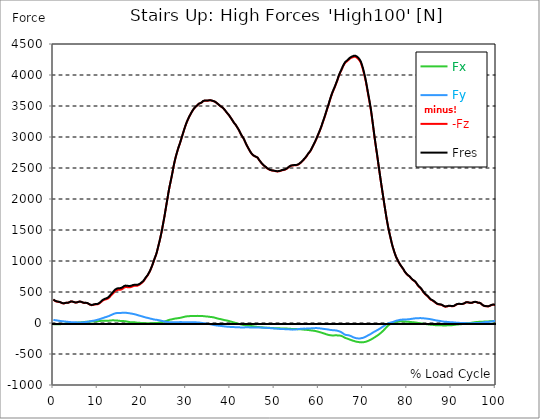
| Category |  Fx |  Fy |  -Fz |  Fres |
|---|---|---|---|---|
| 0.0 | -20.727 | 50.693 | 376.171 | 380.467 |
| 0.16678370786516855 | -21.302 | 48.392 | 366.518 | 370.706 |
| 0.3335674157303371 | -21.823 | 46.163 | 357.134 | 361.215 |
| 0.5003511235955057 | -21.769 | 44.599 | 350.213 | 354.222 |
| 0.6671348314606742 | -21.41 | 43.233 | 346.348 | 350.231 |
| 0.8339185393258427 | -20.745 | 41.561 | 344.012 | 347.643 |
| 1.0007022471910114 | -19.684 | 39.494 | 342.412 | 345.737 |
| 1.1674859550561796 | -18.821 | 37.157 | 340.956 | 343.994 |
| 1.3342696629213484 | -18.516 | 35.036 | 338.421 | 341.243 |
| 1.5010533707865168 | -18.39 | 32.986 | 334.844 | 337.54 |
| 1.6678370786516854 | -18.282 | 31.279 | 330.296 | 332.866 |
| 1.8346207865168538 | -17.743 | 29.877 | 325.298 | 327.743 |
| 2.001404494382023 | -16.592 | 28.69 | 319.492 | 321.865 |
| 2.1681882022471908 | -15.388 | 27.486 | 314.818 | 317.065 |
| 2.334971910112359 | -13.95 | 26.353 | 314.62 | 316.688 |
| 2.501755617977528 | -11.864 | 25.364 | 317.425 | 319.312 |
| 2.668539325842697 | -9.743 | 23.89 | 321.721 | 323.357 |
| 2.8353230337078656 | -8.557 | 22.111 | 325.658 | 327.114 |
| 3.0021067415730336 | -8.305 | 20.727 | 326.88 | 328.264 |
| 3.168890449438202 | -7.82 | 19.45 | 326.593 | 327.941 |
| 3.335674157303371 | -6.975 | 18.318 | 326.269 | 327.527 |
| 3.502457865168539 | -5.393 | 17.149 | 330.709 | 331.878 |
| 3.6692415730337076 | -4.17 | 15.927 | 335.814 | 336.875 |
| 3.8360252808988764 | -2.66 | 14.597 | 342.484 | 343.49 |
| 4.002808988764046 | -1.312 | 13.464 | 347.517 | 348.488 |
| 4.169592696629214 | -0.449 | 12.691 | 347.751 | 348.685 |
| 4.3363764044943816 | 0.036 | 12.062 | 344.479 | 345.396 |
| 4.50316011235955 | 0.288 | 11.613 | 340.758 | 341.657 |
| 4.669943820224718 | 0.395 | 11.217 | 335.85 | 336.749 |
| 4.836727528089888 | 0.737 | 10.858 | 331.608 | 332.525 |
| 5.003511235955056 | 1.959 | 10.516 | 330.26 | 331.194 |
| 5.170294943820225 | 3.649 | 10.211 | 330.547 | 331.482 |
| 5.337078651685394 | 5.087 | 9.905 | 332.435 | 333.388 |
| 5.5038623595505625 | 6.418 | 9.456 | 335.742 | 336.695 |
| 5.670646067415731 | 7.55 | 8.988 | 339.913 | 340.866 |
| 5.837429775280899 | 8.629 | 8.485 | 344.281 | 345.216 |
| 6.004213483146067 | 9.258 | 8.395 | 345.45 | 346.384 |
| 6.170997191011236 | 9.887 | 8.844 | 343.095 | 344.048 |
| 6.329002808988764 | 10.426 | 9.312 | 339.607 | 340.578 |
| 6.495786516853932 | 11.595 | 10.031 | 335.113 | 336.102 |
| 6.662570224719101 | 13.069 | 11.199 | 329.631 | 330.673 |
| 6.82935393258427 | 14.363 | 12.17 | 325.334 | 326.467 |
| 6.9961376404494375 | 15.873 | 13.105 | 323.123 | 324.328 |
| 7.162921348314607 | 17.635 | 14.165 | 323.842 | 325.154 |
| 7.329705056179775 | 19.217 | 15.172 | 325.154 | 326.557 |
| 7.496488764044945 | 20.349 | 16.466 | 324.166 | 325.694 |
| 7.663272471910113 | 21.068 | 18.534 | 320.642 | 322.314 |
| 7.830056179775281 | 21.5 | 20.457 | 315.285 | 317.137 |
| 7.996839887640449 | 21.877 | 22.866 | 307.16 | 309.21 |
| 8.16362359550562 | 22.309 | 25.472 | 298.55 | 300.833 |
| 8.330407303370787 | 22.92 | 27.863 | 293.948 | 296.518 |
| 8.497191011235955 | 23.747 | 30.038 | 289.705 | 292.581 |
| 8.663974719101123 | 24.771 | 32.07 | 287.35 | 290.55 |
| 8.830758426966291 | 26.012 | 34.209 | 289.13 | 292.617 |
| 8.99754213483146 | 26.928 | 36.348 | 292.24 | 295.997 |
| 9.16432584269663 | 27.665 | 38.541 | 296.464 | 300.491 |
| 9.331109550561798 | 27.737 | 40.626 | 299.862 | 304.104 |
| 9.497893258426966 | 27.252 | 42.676 | 300.096 | 304.572 |
| 9.664676966292134 | 27.324 | 45.786 | 300.203 | 305.165 |
| 9.831460674157304 | 27.414 | 48.877 | 300.311 | 305.758 |
| 9.998244382022472 | 28.025 | 52.491 | 301.606 | 307.7 |
| 10.16502808988764 | 29.625 | 56.086 | 306.225 | 313.003 |
| 10.331811797752808 | 31.153 | 59.663 | 313.326 | 320.75 |
| 10.498595505617978 | 32.663 | 63.258 | 321.056 | 329.073 |
| 10.665379213483147 | 33.903 | 67.267 | 330.673 | 339.356 |
| 10.832162921348315 | 34.874 | 71.51 | 341.998 | 351.346 |
| 10.998946629213483 | 35.791 | 75.68 | 353.108 | 363.12 |
| 11.165730337078653 | 36.312 | 79.527 | 361.682 | 372.306 |
| 11.33251404494382 | 36.222 | 83.41 | 368.783 | 380.072 |
| 11.49929775280899 | 36.096 | 87.221 | 374.068 | 386.058 |
| 11.666081460674157 | 36.15 | 91.877 | 378.292 | 391.199 |
| 11.832865168539326 | 35.557 | 95.418 | 381.24 | 394.848 |
| 11.999648876404493 | 34.964 | 98.456 | 384.099 | 398.336 |
| 12.166432584269662 | 34.748 | 102.069 | 387.802 | 402.812 |
| 12.333216292134832 | 35.719 | 106.815 | 394.417 | 410.434 |
| 12.5 | 36.923 | 111.345 | 402.596 | 419.566 |
| 12.66678370786517 | 38.379 | 115.785 | 413.346 | 431.16 |
| 12.833567415730336 | 40.051 | 120.513 | 426.199 | 444.894 |
| 13.000351123595506 | 41.309 | 126.912 | 441.245 | 461.145 |
| 13.167134831460674 | 42.496 | 132.916 | 454.296 | 475.382 |
| 13.333918539325843 | 42.927 | 137.68 | 465.549 | 487.498 |
| 13.500702247191011 | 42.766 | 142.839 | 477.162 | 500.027 |
| 13.667485955056181 | 42.64 | 147.801 | 491.327 | 514.948 |
| 13.834269662921349 | 42.352 | 152.546 | 505.061 | 529.401 |
| 14.001053370786519 | 41.166 | 155.926 | 515.559 | 540.294 |
| 14.167837078651687 | 40.447 | 158.461 | 522.66 | 547.736 |
| 14.334620786516853 | 39.62 | 160.6 | 528.646 | 553.992 |
| 14.501404494382026 | 38.847 | 161.876 | 532.87 | 558.36 |
| 14.668188202247192 | 37.876 | 162.577 | 535.549 | 561.093 |
| 14.834971910112362 | 36.15 | 162.541 | 535.872 | 561.344 |
| 15.001755617977528 | 34.514 | 162.523 | 535.944 | 561.362 |
| 15.168539325842698 | 32.861 | 162.505 | 536.016 | 561.38 |
| 15.335323033707864 | 32.124 | 162.955 | 539.755 | 565.048 |
| 15.502106741573034 | 31.764 | 163.997 | 545.4 | 570.71 |
| 15.6688904494382 | 31.405 | 164.734 | 553.093 | 578.242 |
| 15.83567415730337 | 31.099 | 165.633 | 562.783 | 587.752 |
| 16.00245786516854 | 30.416 | 166.101 | 571.483 | 596.164 |
| 16.16924157303371 | 29.373 | 165.885 | 577.361 | 601.665 |
| 16.336025280898877 | 27.809 | 165.076 | 579.357 | 603.301 |
| 16.502808988764045 | 25.418 | 163.889 | 579.896 | 603.409 |
| 16.669592696629216 | 23.064 | 162.344 | 578.566 | 601.647 |
| 16.83637640449438 | 20.403 | 160.6 | 576.337 | 599.023 |
| 17.003160112359552 | 18.048 | 159.198 | 574.863 | 597.243 |
| 17.169943820224717 | 15.675 | 157.508 | 574.305 | 596.308 |
| 17.336727528089888 | 13.752 | 155.531 | 575.492 | 596.955 |
| 17.503511235955056 | 13.069 | 153.553 | 578.961 | 599.832 |
| 17.670294943820224 | 12.296 | 151.594 | 582.772 | 603.085 |
| 17.837078651685395 | 12.583 | 149.401 | 588.147 | 607.777 |
| 18.003862359550563 | 12.943 | 147.154 | 593.126 | 612.091 |
| 18.17064606741573 | 12.835 | 144.745 | 597.207 | 615.507 |
| 18.3374297752809 | 11.864 | 142.012 | 599.85 | 617.448 |
| 18.504213483146067 | 10.031 | 139.028 | 600.155 | 617.107 |
| 18.662219101123597 | 7.802 | 135.721 | 599.85 | 616.046 |
| 18.829002808988765 | 5.555 | 132.197 | 599.382 | 614.77 |
| 18.995786516853933 | 4.278 | 128.746 | 601.539 | 616.172 |
| 19.1625702247191 | 3.541 | 124.45 | 606.285 | 619.929 |
| 19.32935393258427 | 3.074 | 120.8 | 612.469 | 625.232 |
| 19.49613764044944 | 2.607 | 117.691 | 620.109 | 632.207 |
| 19.662921348314608 | 1.87 | 114.724 | 627.497 | 639.074 |
| 19.829705056179776 | 1.24 | 111.201 | 638.013 | 648.835 |
| 19.996488764044944 | 0.647 | 107.875 | 647.846 | 658.093 |
| 20.163272471910112 | -0.162 | 104.568 | 657.14 | 666.919 |
| 20.33005617977528 | -1.204 | 101.045 | 668.735 | 677.902 |
| 20.49683988764045 | -1.995 | 97.305 | 684.931 | 693.344 |
| 20.663623595505616 | -2.553 | 93.602 | 702.332 | 709.99 |
| 20.830407303370787 | -2.229 | 89.863 | 721.297 | 728.326 |
| 20.997191011235955 | -2.409 | 87.239 | 738.357 | 745.152 |
| 21.163974719101123 | -2.984 | 85.1 | 751.929 | 758.58 |
| 21.330758426966295 | -3.218 | 82.295 | 768.97 | 775.262 |
| 21.497542134831463 | -2.894 | 78.79 | 791.44 | 797.193 |
| 21.66432584269663 | -2.876 | 76.183 | 813.066 | 818.513 |
| 21.8311095505618 | -2.948 | 73.721 | 834.062 | 839.203 |
| 21.997893258426966 | -2.337 | 69.766 | 863.381 | 867.965 |
| 22.164676966292134 | -2.696 | 67.213 | 892.593 | 896.997 |
| 22.331460674157306 | -2.966 | 64.876 | 920.816 | 925.04 |
| 22.498244382022467 | -2.193 | 61.209 | 955.725 | 959.447 |
| 22.66502808988764 | -1.654 | 57.919 | 991.139 | 994.428 |
| 22.831811797752806 | -1.186 | 55.726 | 1025.653 | 1028.727 |
| 22.99859550561798 | -0.719 | 54.252 | 1058.064 | 1060.976 |
| 23.165379213483146 | -0.27 | 53.192 | 1089.325 | 1092.075 |
| 23.332162921348313 | 0.18 | 52.652 | 1125.08 | 1127.668 |
| 23.49894662921348 | 0.989 | 50.298 | 1170.865 | 1173.202 |
| 23.665730337078653 | 2.714 | 47.206 | 1219.527 | 1221.576 |
| 23.83251404494382 | 5.033 | 44.473 | 1268.279 | 1270.094 |
| 23.999297752808985 | 8.323 | 42.748 | 1316.904 | 1318.594 |
| 24.166081460674157 | 10.696 | 40.878 | 1367.22 | 1368.802 |
| 24.332865168539325 | 12.332 | 38.092 | 1422.677 | 1424.115 |
| 24.499648876404496 | 13.734 | 35.323 | 1480.416 | 1481.729 |
| 24.666432584269664 | 15.945 | 31.98 | 1543.261 | 1544.448 |
| 24.833216292134832 | 18.372 | 28.42 | 1608.012 | 1609.09 |
| 25.0 | 21.05 | 25.958 | 1670.695 | 1671.702 |
| 25.16678370786517 | 24.07 | 23.765 | 1737.531 | 1738.537 |
| 25.33356741573034 | 28.079 | 21.518 | 1811.521 | 1812.546 |
| 25.500351123595504 | 32.555 | 19.72 | 1882.186 | 1883.264 |
| 25.66713483146067 | 37.085 | 18.569 | 1953.713 | 1954.882 |
| 25.833918539325843 | 40.986 | 17.365 | 2020.549 | 2021.825 |
| 26.00070224719101 | 46.037 | 15.046 | 2094.305 | 2095.69 |
| 26.16748595505618 | 50.046 | 12.907 | 2160.566 | 2162.058 |
| 26.334269662921347 | 53.174 | 11.667 | 2220.732 | 2222.314 |
| 26.50105337078652 | 54.846 | 10.894 | 2276.153 | 2277.753 |
| 26.667837078651687 | 57.236 | 10.498 | 2332.473 | 2334.145 |
| 26.834620786516858 | 60.58 | 10.228 | 2392.675 | 2394.437 |
| 27.001404494382022 | 63.564 | 10.552 | 2454.711 | 2456.563 |
| 27.16818820224719 | 66.26 | 11.487 | 2518.833 | 2520.738 |
| 27.334971910112362 | 68.867 | 12.134 | 2577.13 | 2579.089 |
| 27.50175561797753 | 70.88 | 12.116 | 2627.912 | 2629.908 |
| 27.668539325842698 | 72.678 | 11.9 | 2676.754 | 2678.785 |
| 27.835323033707866 | 74.134 | 11.613 | 2719.609 | 2721.641 |
| 28.002106741573037 | 75.806 | 11.613 | 2760.469 | 2762.519 |
| 28.168890449438205 | 77.568 | 11.954 | 2802.318 | 2804.385 |
| 28.335674157303373 | 79.419 | 12.871 | 2839.673 | 2841.722 |
| 28.502457865168537 | 81.253 | 13.986 | 2872.929 | 2874.942 |
| 28.669241573033705 | 83.338 | 15.1 | 2908.342 | 2910.337 |
| 28.836025280898877 | 85.477 | 15.531 | 2946.955 | 2948.95 |
| 29.002808988764052 | 88.443 | 14.381 | 2986.521 | 2988.516 |
| 29.169592696629213 | 91.661 | 13.033 | 3025.439 | 3027.417 |
| 29.336376404494384 | 94.987 | 11.882 | 3063.261 | 3065.239 |
| 29.50316011235955 | 98.258 | 10.948 | 3101.065 | 3103.061 |
| 29.669943820224724 | 100.757 | 12.206 | 3139.84 | 3141.871 |
| 29.836727528089884 | 103.885 | 12.44 | 3174.84 | 3176.907 |
| 30.003511235955056 | 105.718 | 12.907 | 3208.24 | 3210.325 |
| 30.170294943820224 | 107.138 | 12.889 | 3239.303 | 3241.406 |
| 30.337078651685395 | 108.666 | 12.17 | 3267.04 | 3269.161 |
| 30.503862359550563 | 109.727 | 12.008 | 3293.357 | 3295.497 |
| 30.670646067415728 | 110.123 | 11.649 | 3318.938 | 3321.059 |
| 30.837429775280903 | 110.896 | 11.163 | 3342.181 | 3344.32 |
| 30.99543539325843 | 111.884 | 11.523 | 3364.364 | 3366.503 |
| 31.162219101123597 | 112.819 | 12.368 | 3386.223 | 3388.38 |
| 31.32900280898876 | 113.053 | 13.105 | 3407.255 | 3409.394 |
| 31.495786516853936 | 112.945 | 13.554 | 3427.442 | 3429.563 |
| 31.6625702247191 | 113.592 | 12.583 | 3444.789 | 3446.911 |
| 31.82935393258427 | 113.772 | 11.828 | 3461.238 | 3463.359 |
| 31.996137640449433 | 113.268 | 11.361 | 3475.007 | 3477.093 |
| 32.162921348314605 | 113.143 | 10.66 | 3486.908 | 3488.975 |
| 32.329705056179776 | 113.538 | 10.121 | 3497.352 | 3499.419 |
| 32.49648876404494 | 114.617 | 9.456 | 3507.041 | 3509.144 |
| 32.66327247191011 | 115.102 | 8.772 | 3519.642 | 3521.764 |
| 32.83005617977528 | 113.43 | 8.089 | 3532.334 | 3534.365 |
| 32.996839887640455 | 112.603 | 6.957 | 3539.183 | 3541.178 |
| 33.16362359550562 | 112.657 | 5.357 | 3543.713 | 3545.708 |
| 33.330407303370784 | 112.927 | 3.757 | 3547.524 | 3549.519 |
| 33.497191011235955 | 112.603 | 2.121 | 3553.689 | 3555.667 |
| 33.66397471910113 | 112.28 | -0.072 | 3565.518 | 3567.477 |
| 33.83075842696629 | 111.722 | -1.905 | 3576.501 | 3578.425 |
| 33.997542134831455 | 110.069 | -3.2 | 3583.386 | 3585.256 |
| 34.164325842696634 | 108.559 | -5.051 | 3586.119 | 3587.934 |
| 34.3311095505618 | 107.246 | -6.993 | 3587.503 | 3589.3 |
| 34.49789325842697 | 106.312 | -8.683 | 3586.622 | 3588.384 |
| 34.66467696629213 | 105.449 | -10.354 | 3585.31 | 3587.071 |
| 34.831460674157306 | 104.352 | -11.972 | 3585.076 | 3586.802 |
| 34.99824438202247 | 102.752 | -13.86 | 3586.91 | 3588.599 |
| 35.16502808988764 | 100.919 | -16.286 | 3590.127 | 3591.799 |
| 35.331811797752806 | 99.157 | -18.605 | 3592.824 | 3594.442 |
| 35.49859550561798 | 97.629 | -20.583 | 3592.536 | 3594.136 |
| 35.66537921348315 | 96.335 | -22.632 | 3590.451 | 3592.033 |
| 35.83216292134831 | 95.238 | -25.095 | 3586.083 | 3587.665 |
| 35.998946629213485 | 93.98 | -27.63 | 3580.923 | 3582.505 |
| 36.16573033707865 | 91.643 | -29.912 | 3578.91 | 3580.474 |
| 36.33251404494382 | 89.216 | -32.231 | 3576.933 | 3578.461 |
| 36.499297752808985 | 85.855 | -34.389 | 3570.12 | 3571.594 |
| 36.666081460674164 | 82.331 | -36.977 | 3562.911 | 3564.349 |
| 36.83286516853932 | 78.826 | -39.044 | 3553.654 | 3555.056 |
| 36.99964887640449 | 74.961 | -40.608 | 3543.245 | 3544.576 |
| 37.166432584269664 | 71.851 | -41.993 | 3534.131 | 3535.462 |
| 37.333216292134836 | 68.921 | -43.233 | 3524.676 | 3525.97 |
| 37.5 | 66.35 | -44.024 | 3514.375 | 3515.67 |
| 37.666783707865164 | 64.463 | -45.534 | 3504.129 | 3505.405 |
| 37.833567415730336 | 62.467 | -46.9 | 3493.99 | 3495.267 |
| 38.00035112359551 | 59.681 | -48.302 | 3486.62 | 3487.86 |
| 38.16713483146068 | 56.625 | -49.992 | 3479.304 | 3480.49 |
| 38.333918539325836 | 53.102 | -51.43 | 3468.338 | 3469.507 |
| 38.50070224719101 | 49.974 | -52.832 | 3456.851 | 3458.002 |
| 38.66748595505618 | 47.116 | -54.594 | 3444.412 | 3445.544 |
| 38.83426966292135 | 44.779 | -56.194 | 3429.06 | 3430.193 |
| 39.001053370786515 | 43.233 | -57.596 | 3412.288 | 3413.439 |
| 39.16783707865169 | 41.148 | -58.585 | 3396.397 | 3397.512 |
| 39.33462078651686 | 38.631 | -59.645 | 3382.825 | 3383.922 |
| 39.50140449438202 | 35.899 | -60.346 | 3369.918 | 3370.997 |
| 39.668188202247194 | 32.717 | -61.371 | 3354.872 | 3355.933 |
| 39.83497191011236 | 29.193 | -62.36 | 3337.813 | 3338.855 |
| 40.00175561797753 | 25.598 | -63.115 | 3320.663 | 3321.706 |
| 40.168539325842694 | 21.985 | -63.636 | 3303.19 | 3304.197 |
| 40.335323033707866 | 18.677 | -64.103 | 3285.034 | 3286.041 |
| 40.50210674157304 | 15.298 | -64.679 | 3266.645 | 3267.669 |
| 40.6688904494382 | 11.918 | -65.308 | 3247.877 | 3248.884 |
| 40.83567415730337 | 8.647 | -65.955 | 3228.913 | 3229.937 |
| 41.00245786516854 | 5.051 | -66.656 | 3215.071 | 3216.095 |
| 41.16924157303371 | 1.528 | -67.303 | 3200.636 | 3201.661 |
| 41.33602528089887 | -1.744 | -67.591 | 3183.073 | 3184.098 |
| 41.502808988764045 | -5.105 | -67.717 | 3163.91 | 3164.953 |
| 41.669592696629216 | -8.377 | -67.95 | 3144.802 | 3145.862 |
| 41.83637640449439 | -11.541 | -68.31 | 3125.477 | 3126.556 |
| 42.00316011235955 | -15.136 | -69.029 | 3103.798 | 3104.912 |
| 42.16994382022472 | -18.911 | -70.521 | 3078.469 | 3079.638 |
| 42.33672752808989 | -21.931 | -71.635 | 3054.866 | 3056.107 |
| 42.50351123595506 | -24.412 | -72.318 | 3032.198 | 3033.493 |
| 42.670294943820224 | -26.677 | -73.002 | 3013.413 | 3014.743 |
| 42.83707865168539 | -29.823 | -72.498 | 2995.293 | 2996.641 |
| 43.00386235955057 | -33.022 | -72.049 | 2976.885 | 2978.252 |
| 43.17064606741573 | -35.953 | -71.132 | 2952.869 | 2954.271 |
| 43.32865168539326 | -38.487 | -70.539 | 2926.121 | 2927.559 |
| 43.495435393258425 | -40.357 | -70.449 | 2898.886 | 2900.361 |
| 43.6622191011236 | -41.651 | -70.089 | 2873.702 | 2875.194 |
| 43.82900280898876 | -42.172 | -69.37 | 2851.339 | 2852.831 |
| 43.99578651685393 | -42.963 | -69.712 | 2829.246 | 2830.774 |
| 44.162570224719104 | -43.772 | -70.179 | 2807.405 | 2808.969 |
| 44.32935393258427 | -44.527 | -70.647 | 2786.247 | 2787.865 |
| 44.49613764044944 | -45.282 | -71.114 | 2765.107 | 2766.743 |
| 44.66292134831461 | -46.81 | -71.851 | 2746.897 | 2748.605 |
| 44.82970505617978 | -48.698 | -72.031 | 2730.323 | 2732.103 |
| 44.99648876404493 | -50.729 | -71.995 | 2716.949 | 2718.764 |
| 45.16327247191011 | -52.796 | -71.887 | 2705.049 | 2706.918 |
| 45.33005617977528 | -54.738 | -72.067 | 2697.409 | 2699.332 |
| 45.49683988764045 | -56.553 | -72.283 | 2690.811 | 2692.771 |
| 45.66362359550561 | -57.955 | -72.318 | 2682.848 | 2684.843 |
| 45.83040730337079 | -60.023 | -72.696 | 2679.378 | 2681.428 |
| 45.99719101123596 | -62.144 | -73.109 | 2676.161 | 2678.246 |
| 46.16397471910113 | -63.888 | -72.66 | 2666.472 | 2668.575 |
| 46.33075842696629 | -65.164 | -71.581 | 2649.017 | 2651.156 |
| 46.497542134831455 | -65.667 | -72.696 | 2630.267 | 2632.46 |
| 46.66432584269663 | -66.818 | -73.109 | 2614.844 | 2617.109 |
| 46.83110955056179 | -67.267 | -74.17 | 2599.852 | 2602.188 |
| 46.99789325842696 | -68.22 | -74.619 | 2583.493 | 2585.902 |
| 47.164676966292134 | -69.155 | -75.033 | 2569.633 | 2572.078 |
| 47.331460674157306 | -70.593 | -74.853 | 2557.014 | 2559.513 |
| 47.49824438202247 | -72.3 | -74.53 | 2545.114 | 2547.684 |
| 47.66502808988764 | -73.793 | -74.781 | 2534.4 | 2537.025 |
| 47.83181179775281 | -75.518 | -74.997 | 2524.639 | 2527.353 |
| 47.99859550561797 | -77.37 | -75.356 | 2516.532 | 2519.318 |
| 48.16537921348314 | -77.352 | -77.424 | 2504.685 | 2507.525 |
| 48.33216292134831 | -77.298 | -79.078 | 2494.349 | 2497.243 |
| 48.498946629213485 | -78.017 | -79.707 | 2487.68 | 2490.628 |
| 48.66573033707865 | -78.484 | -80.192 | 2480.723 | 2483.725 |
| 48.83251404494382 | -78.592 | -81.235 | 2474.198 | 2477.235 |
| 48.99929775280899 | -78.646 | -82.547 | 2467.978 | 2471.07 |
| 49.166081460674164 | -79.203 | -83.302 | 2464.275 | 2467.42 |
| 49.33286516853933 | -80.03 | -83.751 | 2461.039 | 2464.239 |
| 49.499648876404486 | -80.947 | -84.686 | 2458.432 | 2461.686 |
| 49.666432584269664 | -82.008 | -86.232 | 2456.671 | 2460.014 |
| 49.83321629213483 | -82.978 | -87.508 | 2454.855 | 2458.271 |
| 50.0 | -83.608 | -88.371 | 2452.626 | 2456.095 |
| 50.166783707865164 | -83.644 | -89 | 2449.66 | 2453.147 |
| 50.33356741573034 | -83.626 | -89.576 | 2447.071 | 2450.559 |
| 50.50035112359551 | -83.59 | -90.51 | 2444.914 | 2448.438 |
| 50.66713483146068 | -83.931 | -92.038 | 2444.267 | 2447.862 |
| 50.83391853932584 | -84.794 | -93.297 | 2445.148 | 2448.833 |
| 51.00070224719101 | -85.693 | -94.375 | 2447.035 | 2450.81 |
| 51.16748595505618 | -86.34 | -95.472 | 2450.055 | 2453.884 |
| 51.33426966292134 | -86.933 | -96.479 | 2453.201 | 2457.102 |
| 51.50105337078652 | -87.095 | -96.622 | 2458.271 | 2462.171 |
| 51.66783707865169 | -87.329 | -96.784 | 2462.603 | 2466.504 |
| 51.83462078651686 | -87.526 | -97.126 | 2464.958 | 2468.895 |
| 52.00140449438202 | -87.616 | -97.629 | 2466.486 | 2470.422 |
| 52.168188202247194 | -88.102 | -98.528 | 2468.895 | 2472.885 |
| 52.33497191011236 | -88.605 | -99.283 | 2472.058 | 2476.085 |
| 52.50175561797752 | -89.18 | -99.66 | 2477.038 | 2481.082 |
| 52.668539325842694 | -89.773 | -99.66 | 2483.293 | 2487.338 |
| 52.835323033707866 | -90.241 | -100.182 | 2490.502 | 2494.583 |
| 53.00210674157304 | -91.05 | -100.523 | 2500.065 | 2504.164 |
| 53.1688904494382 | -91.984 | -101.08 | 2509.844 | 2513.961 |
| 53.33567415730337 | -93.099 | -101.925 | 2519.857 | 2524.028 |
| 53.502457865168545 | -93.746 | -103.561 | 2527.821 | 2532.063 |
| 53.669241573033716 | -94.555 | -105.341 | 2534.112 | 2538.445 |
| 53.83602528089887 | -95.472 | -106.204 | 2537.905 | 2542.274 |
| 54.002808988764045 | -95.885 | -106.977 | 2539.433 | 2543.838 |
| 54.169592696629216 | -96.407 | -107.246 | 2541.519 | 2545.959 |
| 54.33637640449438 | -96.748 | -106.581 | 2542.148 | 2546.588 |
| 54.50316011235955 | -97.09 | -105.988 | 2543.19 | 2547.631 |
| 54.669943820224724 | -97.539 | -105.107 | 2544.395 | 2548.799 |
| 54.836727528089895 | -98.007 | -103.957 | 2545.132 | 2549.5 |
| 55.00351123595506 | -98.492 | -102.662 | 2546.21 | 2550.543 |
| 55.17029494382022 | -99.013 | -100.254 | 2549.913 | 2554.156 |
| 55.337078651685395 | -99.535 | -98.007 | 2554.066 | 2558.219 |
| 55.50386235955056 | -100.218 | -96.856 | 2561.454 | 2565.607 |
| 55.66186797752809 | -100.919 | -95.544 | 2569.436 | 2573.552 |
| 55.82865168539326 | -101.584 | -94.447 | 2578.909 | 2582.99 |
| 55.995435393258425 | -102.285 | -93.423 | 2589.335 | 2593.416 |
| 56.1622191011236 | -103.148 | -92.398 | 2600.319 | 2604.382 |
| 56.32900280898877 | -104.406 | -91.355 | 2612.633 | 2616.695 |
| 56.49578651685393 | -105.88 | -90.546 | 2625.809 | 2629.872 |
| 56.6625702247191 | -107.085 | -90.421 | 2638.752 | 2642.815 |
| 56.82935393258427 | -108.127 | -90.654 | 2651.515 | 2655.614 |
| 56.99613764044943 | -109.152 | -91.068 | 2664.979 | 2669.114 |
| 57.16292134831461 | -110.284 | -90.78 | 2680.026 | 2684.16 |
| 57.329705056179776 | -111.183 | -90.187 | 2697.067 | 2701.166 |
| 57.49648876404495 | -112.226 | -89.63 | 2715.726 | 2719.807 |
| 57.66327247191011 | -113.376 | -89.18 | 2733.469 | 2737.532 |
| 57.83005617977529 | -114.958 | -88.425 | 2746.987 | 2751.05 |
| 57.99683988764044 | -117.025 | -87.544 | 2761.44 | 2765.521 |
| 58.16362359550561 | -118.535 | -87.005 | 2778.805 | 2782.886 |
| 58.33040730337079 | -119.794 | -86.016 | 2800.682 | 2804.745 |
| 58.497191011235955 | -121.232 | -85.171 | 2825.651 | 2829.732 |
| 58.66397471910112 | -122.994 | -83.985 | 2848.104 | 2852.202 |
| 58.83075842696629 | -124.719 | -83.086 | 2871.167 | 2875.284 |
| 58.99754213483147 | -126.301 | -82.978 | 2895.974 | 2900.145 |
| 59.164325842696634 | -127.901 | -82.871 | 2920.8 | 2924.988 |
| 59.33110955056179 | -130.759 | -82.313 | 2946.739 | 2950.982 |
| 59.49789325842697 | -133.869 | -81.918 | 2973.452 | 2977.766 |
| 59.664676966292134 | -136.907 | -82.691 | 3002.448 | 3006.906 |
| 59.8314606741573 | -139.801 | -83.931 | 3031.174 | 3035.776 |
| 59.99824438202247 | -142.875 | -84.956 | 3057.868 | 3062.596 |
| 60.16502808988765 | -146.147 | -85.926 | 3086.756 | 3091.628 |
| 60.33181179775281 | -149.544 | -87.041 | 3117.172 | 3122.187 |
| 60.49859550561798 | -153.158 | -88.551 | 3147.642 | 3152.819 |
| 60.66537921348315 | -156.969 | -90.439 | 3181.293 | 3186.668 |
| 60.83216292134831 | -160.69 | -92.254 | 3217.695 | 3223.232 |
| 60.99894662921348 | -164.393 | -94.16 | 3252.983 | 3258.717 |
| 61.16573033707864 | -168.006 | -95.49 | 3285.789 | 3291.668 |
| 61.33251404494383 | -171.997 | -97.054 | 3321.454 | 3327.512 |
| 61.49929775280899 | -175.826 | -98.744 | 3358.737 | 3364.975 |
| 61.66608146067416 | -180.338 | -99.948 | 3397.224 | 3403.66 |
| 61.83286516853932 | -184.436 | -101.332 | 3434.741 | 3441.356 |
| 61.99964887640451 | -187.996 | -103.417 | 3471.61 | 3478.405 |
| 62.16643258426967 | -191.016 | -105.179 | 3505.549 | 3512.506 |
| 62.33321629213482 | -193.838 | -107.48 | 3546.553 | 3553.671 |
| 62.5 | -196.624 | -109.781 | 3587.521 | 3594.783 |
| 62.66678370786517 | -198.296 | -111.704 | 3624.39 | 3631.724 |
| 62.833567415730336 | -199.015 | -113.214 | 3660.127 | 3667.461 |
| 63.0003511235955 | -200.13 | -114.671 | 3695.199 | 3702.551 |
| 63.16713483146068 | -200.651 | -115.569 | 3725.542 | 3732.895 |
| 63.33391853932585 | -200.076 | -116.055 | 3754.107 | 3761.387 |
| 63.500702247191015 | -199.806 | -116.936 | 3782.491 | 3789.718 |
| 63.66748595505618 | -199.357 | -118.176 | 3809.995 | 3817.185 |
| 63.83426966292135 | -199.231 | -119.452 | 3841.813 | 3848.985 |
| 64.00105337078651 | -199.267 | -121.591 | 3873.523 | 3880.713 |
| 64.16783707865169 | -199.267 | -123.964 | 3904.352 | 3911.579 |
| 64.33462078651687 | -200.004 | -127.218 | 3940.269 | 3947.585 |
| 64.50140449438203 | -201.226 | -130.975 | 3976.203 | 3983.645 |
| 64.6681882022472 | -202.089 | -134.966 | 4006.835 | 4014.385 |
| 64.83497191011236 | -203.06 | -139.711 | 4033.494 | 4041.241 |
| 65.00175561797754 | -205.127 | -144.457 | 4058.858 | 4066.84 |
| 65.16853932584269 | -208.722 | -151.702 | 4085.032 | 4093.48 |
| 65.33532303370787 | -214.295 | -159.827 | 4111.241 | 4120.319 |
| 65.50210674157304 | -221.252 | -167.898 | 4138.421 | 4148.2 |
| 65.66889044943821 | -227.723 | -176.455 | 4160.963 | 4171.425 |
| 65.83567415730337 | -234.698 | -183.879 | 4181.097 | 4192.206 |
| 66.00245786516854 | -241.295 | -190.728 | 4199.073 | 4210.793 |
| 66.1692415730337 | -244.801 | -193.263 | 4209.032 | 4221.04 |
| 66.33602528089888 | -248.072 | -194.359 | 4218.074 | 4230.28 |
| 66.50280898876404 | -252.53 | -195.348 | 4227.26 | 4239.735 |
| 66.66959269662921 | -257.851 | -196.75 | 4239.088 | 4251.905 |
| 66.83637640449439 | -262.831 | -199.015 | 4250.97 | 4264.165 |
| 67.00316011235955 | -266.57 | -203.042 | 4261.468 | 4275.059 |
| 67.16994382022472 | -270.938 | -207.913 | 4270.888 | 4284.963 |
| 67.33672752808988 | -274.875 | -213.252 | 4277.144 | 4291.723 |
| 67.50351123595506 | -279.477 | -219.436 | 4279.193 | 4294.365 |
| 67.67029494382022 | -283.809 | -225.494 | 4286.132 | 4301.879 |
| 67.83707865168539 | -287.296 | -230.851 | 4293.412 | 4309.645 |
| 67.99508426966291 | -290.101 | -235.022 | 4295.749 | 4312.359 |
| 68.16186797752809 | -294.343 | -239.048 | 4295.641 | 4312.755 |
| 68.32865168539327 | -298.604 | -242.715 | 4292.37 | 4309.986 |
| 68.49543539325843 | -301.749 | -245.376 | 4284.981 | 4302.994 |
| 68.6622191011236 | -303.511 | -247.407 | 4277.431 | 4295.713 |
| 68.82900280898876 | -305.129 | -248.36 | 4267.293 | 4285.736 |
| 68.99578651685394 | -306.909 | -248.773 | 4254.727 | 4273.351 |
| 69.1625702247191 | -308.365 | -249.169 | 4239.43 | 4258.233 |
| 69.32935393258425 | -310.648 | -249.133 | 4222.73 | 4241.749 |
| 69.49613764044945 | -312.158 | -246.472 | 4200.439 | 4219.494 |
| 69.66292134831461 | -312.625 | -243.866 | 4168.531 | 4187.586 |
| 69.82970505617978 | -312.23 | -241.709 | 4130.044 | 4149.099 |
| 69.99648876404494 | -311.457 | -239.48 | 4090.299 | 4109.353 |
| 70.16327247191012 | -310.108 | -234.878 | 4044.513 | 4063.406 |
| 70.33005617977528 | -307.25 | -229.683 | 3994 | 4012.623 |
| 70.49683988764045 | -304.662 | -224.254 | 3943.073 | 3961.427 |
| 70.66362359550561 | -302.163 | -218.771 | 3886.753 | 3904.838 |
| 70.83040730337079 | -298.352 | -212.569 | 3822.83 | 3840.59 |
| 70.99719101123596 | -293.678 | -205.81 | 3755.131 | 3772.46 |
| 71.16397471910112 | -288.375 | -199.177 | 3687.433 | 3704.295 |
| 71.3307584269663 | -283.018 | -193.083 | 3622.808 | 3639.22 |
| 71.49754213483146 | -277.535 | -187.241 | 3558.974 | 3574.901 |
| 71.66432584269663 | -272.125 | -180.518 | 3489.442 | 3504.902 |
| 71.83110955056179 | -266.282 | -173.075 | 3412.917 | 3427.874 |
| 71.99789325842697 | -259.649 | -165.417 | 3329.741 | 3344.14 |
| 72.16467696629215 | -252.135 | -158.011 | 3239.339 | 3253.198 |
| 72.3314606741573 | -244.729 | -150.605 | 3148.289 | 3161.591 |
| 72.49824438202248 | -237.412 | -143.882 | 3056.844 | 3069.625 |
| 72.66502808988764 | -230.24 | -137.482 | 2968.365 | 2980.642 |
| 72.8318117977528 | -222.852 | -130.723 | 2883.391 | 2895.147 |
| 72.99859550561797 | -215.086 | -124.306 | 2800.664 | 2811.845 |
| 73.16537921348315 | -207.015 | -117.888 | 2723.798 | 2734.368 |
| 73.33216292134833 | -198.979 | -111.381 | 2639.327 | 2649.304 |
| 73.49894662921349 | -190.71 | -104.82 | 2551.927 | 2561.328 |
| 73.66573033707864 | -181.488 | -97.665 | 2468.643 | 2477.361 |
| 73.83251404494382 | -171.619 | -90.6 | 2385.682 | 2393.7 |
| 73.99929775280899 | -162.218 | -82.691 | 2302.866 | 2310.164 |
| 74.16608146067415 | -152.6 | -74.925 | 2222.872 | 2229.487 |
| 74.33286516853933 | -141.437 | -67.141 | 2145.502 | 2151.326 |
| 74.49964887640449 | -130.148 | -59.34 | 2068.024 | 2073.093 |
| 74.66643258426967 | -118.41 | -51.448 | 1989.917 | 1994.25 |
| 74.83321629213484 | -106.024 | -43.125 | 1911.864 | 1915.46 |
| 75.0 | -93.225 | -35.539 | 1838.629 | 1841.559 |
| 75.16678370786516 | -79.617 | -27.306 | 1763.758 | 1766.005 |
| 75.33356741573033 | -65.847 | -19.289 | 1689.48 | 1691.098 |
| 75.5003511235955 | -54.594 | -13.231 | 1624.334 | 1625.503 |
| 75.66713483146067 | -43.7 | -7.694 | 1559.853 | 1560.662 |
| 75.83391853932585 | -33.741 | -2.876 | 1501.413 | 1502.006 |
| 76.00070224719101 | -24.789 | 1.456 | 1446.046 | 1446.441 |
| 76.16748595505618 | -17.671 | 5.087 | 1394.706 | 1394.975 |
| 76.33426966292136 | -11.235 | 8.341 | 1342.395 | 1342.628 |
| 76.50105337078652 | -4.997 | 11.505 | 1290.731 | 1290.929 |
| 76.66783707865167 | -0.18 | 14.687 | 1245.557 | 1245.79 |
| 76.83462078651685 | 4.35 | 18.102 | 1204.786 | 1205.074 |
| 77.00140449438202 | 8.197 | 22.434 | 1167.414 | 1167.827 |
| 77.1681882022472 | 12.08 | 26.713 | 1129.825 | 1130.365 |
| 77.33497191011236 | 16.322 | 31.62 | 1095.689 | 1096.408 |
| 77.50175561797754 | 19.954 | 35.953 | 1064.374 | 1065.309 |
| 77.6685393258427 | 22.452 | 39.026 | 1039.513 | 1040.609 |
| 77.83532303370787 | 24.142 | 41.921 | 1015.532 | 1016.791 |
| 78.00210674157303 | 24.142 | 44.401 | 992.828 | 994.213 |
| 78.1688904494382 | 24.358 | 47.08 | 970.232 | 971.778 |
| 78.33567415730337 | 25.508 | 50.064 | 948.859 | 950.638 |
| 78.50245786516854 | 27.018 | 52.473 | 930.685 | 932.644 |
| 78.66924157303372 | 27.522 | 53.677 | 913.949 | 916.034 |
| 78.83602528089888 | 27.468 | 54.288 | 897.716 | 899.873 |
| 79.00280898876404 | 27.306 | 54.935 | 882.436 | 884.647 |
| 79.16959269662921 | 26.173 | 54.81 | 863.507 | 865.736 |
| 79.33637640449439 | 24.394 | 54.648 | 841.325 | 843.554 |
| 79.50316011235955 | 22.758 | 55.277 | 823.007 | 825.272 |
| 79.66994382022472 | 22.309 | 55.798 | 808.788 | 811.107 |
| 79.8367275280899 | 21.482 | 56.805 | 793.022 | 795.485 |
| 80.00351123595506 | 20.403 | 58.261 | 778.39 | 781.032 |
| 80.17029494382022 | 19.504 | 59.286 | 769.042 | 771.756 |
| 80.32830056179776 | 18.839 | 60.167 | 761.582 | 764.368 |
| 80.49508426966293 | 18.03 | 61.299 | 752.989 | 755.883 |
| 80.66186797752809 | 16.916 | 63.043 | 740.765 | 743.857 |
| 80.82865168539325 | 15.567 | 65.002 | 725.486 | 728.793 |
| 80.99543539325842 | 14.435 | 67.105 | 711.159 | 714.7 |
| 81.1622191011236 | 13.338 | 69.065 | 699.348 | 703.069 |
| 81.32900280898878 | 12.116 | 70.503 | 690.486 | 694.369 |
| 81.49578651685394 | 11.055 | 72.121 | 682.882 | 686.945 |
| 81.6625702247191 | 10.049 | 73.864 | 675.494 | 679.736 |
| 81.82935393258427 | 8.844 | 75.59 | 664.834 | 669.31 |
| 81.99613764044945 | 7.101 | 77.064 | 648.565 | 653.329 |
| 82.16292134831461 | 4.89 | 77.945 | 630.877 | 635.91 |
| 82.32970505617978 | 2.499 | 78.323 | 613.547 | 618.779 |
| 82.49648876404494 | 0.485 | 78.466 | 597.8 | 603.175 |
| 82.66327247191012 | -1.186 | 78.394 | 583.995 | 589.477 |
| 82.83005617977528 | -2.517 | 78.718 | 573.712 | 579.303 |
| 82.99683988764045 | -3.937 | 78.844 | 563.627 | 569.326 |
| 83.16362359550563 | -5.734 | 78.754 | 550.846 | 556.653 |
| 83.33040730337079 | -7.748 | 78.161 | 534.146 | 540.061 |
| 83.49719101123596 | -9.689 | 76.974 | 515.253 | 521.311 |
| 83.66397471910112 | -12.098 | 76.183 | 497.96 | 504.162 |
| 83.8307584269663 | -14.291 | 74.817 | 483.022 | 489.26 |
| 83.99754213483146 | -15.783 | 73.577 | 469.468 | 475.742 |
| 84.16432584269663 | -16.898 | 72.498 | 458.179 | 464.47 |
| 84.33110955056179 | -18.336 | 70.952 | 447.447 | 453.703 |
| 84.49789325842697 | -19.972 | 69.496 | 437.848 | 444.049 |
| 84.66467696629213 | -21.625 | 68.058 | 428.284 | 434.45 |
| 84.8314606741573 | -23.567 | 66.53 | 415.018 | 421.202 |
| 84.99824438202248 | -25.149 | 64.786 | 399.972 | 406.173 |
| 85.16502808988764 | -26.479 | 62.719 | 386.112 | 392.278 |
| 85.3318117977528 | -27.504 | 60.616 | 375.991 | 382.031 |
| 85.49859550561797 | -28.187 | 58.261 | 369.682 | 375.506 |
| 85.66537921348315 | -28.798 | 55.726 | 364.397 | 369.951 |
| 85.83216292134831 | -29.805 | 53.246 | 358.249 | 363.606 |
| 85.99894662921348 | -31.458 | 50.298 | 349.728 | 354.959 |
| 86.16573033707866 | -33.364 | 47.475 | 340.344 | 345.504 |
| 86.33251404494384 | -34.838 | 44.833 | 330.457 | 335.563 |
| 86.499297752809 | -35.683 | 42.658 | 320.409 | 325.514 |
| 86.66608146067415 | -36.222 | 40.554 | 311.852 | 316.867 |
| 86.83286516853933 | -36.384 | 38.937 | 305.381 | 310.324 |
| 86.99964887640449 | -36.384 | 37.247 | 301.174 | 305.974 |
| 87.16643258426966 | -36.168 | 35.305 | 299.287 | 303.853 |
| 87.33321629213482 | -35.827 | 33.526 | 298.046 | 302.415 |
| 87.5 | -35.791 | 31.566 | 297.219 | 301.444 |
| 87.66678370786518 | -36.258 | 29.427 | 294.667 | 298.783 |
| 87.83356741573033 | -37.516 | 27.306 | 289.148 | 293.301 |
| 88.00035112359551 | -38.721 | 25.472 | 283.306 | 287.53 |
| 88.16713483146067 | -40.033 | 23.333 | 275.828 | 280.16 |
| 88.33391853932584 | -40.914 | 21.428 | 268.727 | 273.131 |
| 88.500702247191 | -40.86 | 20.475 | 264.736 | 269.14 |
| 88.66748595505618 | -40.267 | 19.882 | 262.903 | 267.217 |
| 88.83426966292136 | -39.278 | 19.181 | 263.208 | 267.361 |
| 89.00105337078652 | -37.966 | 18.246 | 266.084 | 269.967 |
| 89.16783707865169 | -37.121 | 17.024 | 270.758 | 274.425 |
| 89.33462078651687 | -36.33 | 15.783 | 274.929 | 278.38 |
| 89.50140449438203 | -36.294 | 14.471 | 275.486 | 278.902 |
| 89.6681882022472 | -36.456 | 12.889 | 274.875 | 278.29 |
| 89.83497191011236 | -35.917 | 12.008 | 273.365 | 276.708 |
| 90.00175561797754 | -35.485 | 11.541 | 271.046 | 274.336 |
| 90.16853932584269 | -35 | 10.966 | 268.907 | 272.125 |
| 90.33532303370787 | -33.903 | 10.48 | 269.14 | 272.268 |
| 90.50210674157303 | -32.519 | 9.869 | 271.226 | 274.192 |
| 90.6688904494382 | -30.56 | 9.222 | 276.888 | 279.621 |
| 90.83567415730336 | -28.672 | 7.892 | 284.96 | 287.494 |
| 91.00245786516854 | -26.839 | 6.328 | 293.139 | 295.494 |
| 91.1692415730337 | -25.041 | 5.357 | 299.574 | 301.767 |
| 91.33602528089888 | -23.837 | 4.332 | 303.871 | 305.992 |
| 91.50280898876404 | -22.974 | 3.362 | 306.909 | 308.94 |
| 91.66959269662922 | -22.237 | 2.625 | 308.131 | 310.108 |
| 91.83637640449439 | -21.284 | 2.085 | 308.077 | 309.965 |
| 92.00316011235955 | -20.313 | 1.276 | 306.693 | 308.544 |
| 92.16994382022472 | -19.342 | 0.755 | 305.381 | 307.178 |
| 92.3367275280899 | -18.084 | 0.252 | 304.769 | 306.513 |
| 92.50351123595506 | -15.927 | 0.108 | 306.477 | 308.149 |
| 92.66151685393258 | -13.662 | 0.018 | 309.335 | 310.953 |
| 92.82830056179776 | -11.433 | -0.378 | 313.686 | 315.25 |
| 92.99508426966291 | -9.186 | -0.971 | 319.923 | 321.433 |
| 93.16186797752809 | -7.352 | -2.067 | 328.516 | 329.972 |
| 93.32865168539325 | -5.573 | -2.804 | 334.214 | 335.635 |
| 93.49543539325842 | -4.045 | -2.966 | 335.832 | 337.252 |
| 93.66221910112358 | -3.02 | -3.398 | 334.179 | 335.581 |
| 93.82900280898876 | -2.283 | -3.721 | 331.41 | 332.812 |
| 93.99578651685393 | -1.474 | -3.973 | 328.139 | 329.541 |
| 94.1625702247191 | -0.36 | -3.973 | 325.46 | 326.862 |
| 94.32935393258427 | 1.276 | -3.613 | 323.86 | 325.316 |
| 94.49613764044945 | 3.272 | -3.002 | 323.375 | 324.867 |
| 94.66292134831461 | 5.267 | -2.319 | 325.316 | 326.862 |
| 94.82970505617978 | 7.334 | -2.121 | 330.044 | 331.608 |
| 94.99648876404494 | 9.635 | -2.103 | 335.635 | 337.235 |
| 95.16327247191012 | 11.559 | -1.834 | 338.96 | 340.614 |
| 95.33005617977528 | 12.997 | -1.51 | 340.344 | 341.98 |
| 95.49683988764046 | 14.093 | -1.276 | 339.787 | 341.405 |
| 95.66362359550563 | 15.496 | -0.503 | 337.037 | 338.655 |
| 95.83040730337078 | 16.251 | 0.072 | 331.302 | 332.956 |
| 95.99719101123594 | 17.095 | 0.557 | 326.341 | 328.049 |
| 96.16397471910112 | 18.246 | 1.007 | 325.622 | 327.348 |
| 96.33075842696628 | 19.253 | 1.384 | 325.316 | 327.042 |
| 96.49754213483145 | 19.738 | 2.067 | 321.146 | 322.871 |
| 96.66432584269663 | 19.468 | 2.912 | 314.315 | 316.023 |
| 96.8311095505618 | 19.936 | 4.692 | 304.302 | 306.01 |
| 96.99789325842697 | 21.032 | 7.352 | 291.647 | 293.372 |
| 97.16467696629213 | 21.679 | 9.545 | 282.497 | 284.294 |
| 97.3314606741573 | 22.47 | 11.918 | 277.122 | 279.099 |
| 97.49824438202248 | 22.992 | 13.428 | 273.095 | 275.198 |
| 97.66502808988764 | 23.765 | 14.471 | 270.381 | 272.574 |
| 97.8318117977528 | 24.627 | 15.981 | 270.309 | 272.664 |
| 97.99859550561798 | 24.807 | 16.197 | 269.644 | 271.999 |
| 98.16537921348316 | 24.897 | 16.664 | 267.72 | 270.129 |
| 98.33216292134833 | 25.544 | 17.347 | 267.487 | 270.021 |
| 98.49894662921349 | 26.587 | 18.534 | 269.716 | 272.448 |
| 98.66573033707866 | 27.701 | 20.313 | 275.378 | 278.308 |
| 98.8325140449438 | 28.96 | 22.38 | 283.593 | 286.811 |
| 98.99929775280897 | 29.445 | 24.34 | 287.638 | 291.018 |
| 99.16608146067416 | 29.373 | 26.155 | 291.593 | 295.134 |
| 99.33286516853933 | 29.229 | 27.809 | 293.247 | 296.932 |
| 99.49964887640449 | 28.816 | 29.463 | 293.462 | 297.237 |
| 99.66643258426966 | 28.438 | 31.351 | 292.653 | 296.554 |
| 99.83321629213484 | 27.612 | 33.292 | 291.431 | 295.458 |
| 100.0 | 26.713 | 35.233 | 290.209 | 294.361 |